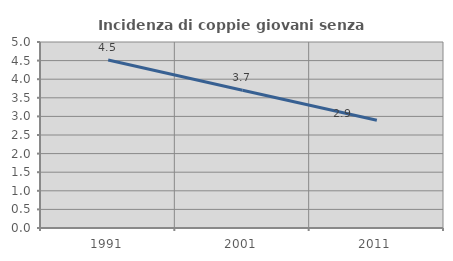
| Category | Incidenza di coppie giovani senza figli |
|---|---|
| 1991.0 | 4.517 |
| 2001.0 | 3.704 |
| 2011.0 | 2.897 |